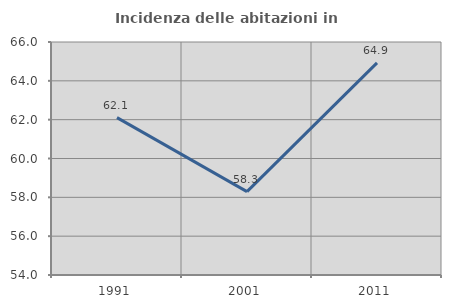
| Category | Incidenza delle abitazioni in proprietà  |
|---|---|
| 1991.0 | 62.108 |
| 2001.0 | 58.296 |
| 2011.0 | 64.924 |